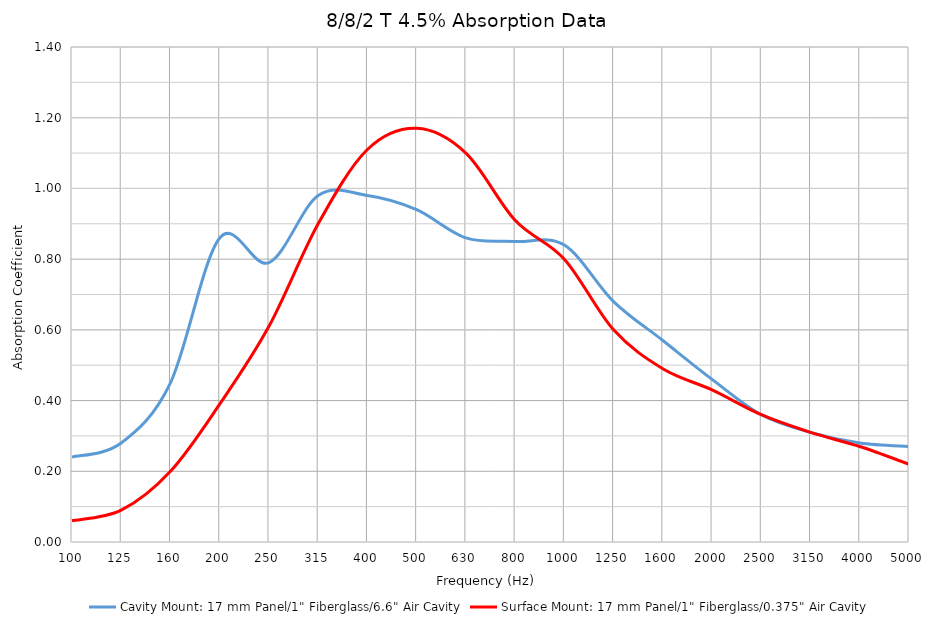
| Category | Cavity Mount: 17 mm Panel/1" Fiberglass/6.6" Air Cavity | Surface Mount: 17 mm Panel/1" Fiberglass/0.375" Air Cavity |
|---|---|---|
| 100.0 | 0.24 | 0.06 |
| 125.0 | 0.28 | 0.09 |
| 160.0 | 0.45 | 0.2 |
| 200.0 | 0.86 | 0.39 |
| 250.0 | 0.79 | 0.61 |
| 315.0 | 0.98 | 0.9 |
| 400.0 | 0.98 | 1.11 |
| 500.0 | 0.94 | 1.17 |
| 630.0 | 0.86 | 1.1 |
| 800.0 | 0.85 | 0.91 |
| 1000.0 | 0.84 | 0.8 |
| 1250.0 | 0.68 | 0.6 |
| 1600.0 | 0.57 | 0.49 |
| 2000.0 | 0.46 | 0.43 |
| 2500.0 | 0.36 | 0.36 |
| 3150.0 | 0.31 | 0.31 |
| 4000.0 | 0.28 | 0.27 |
| 5000.0 | 0.27 | 0.22 |